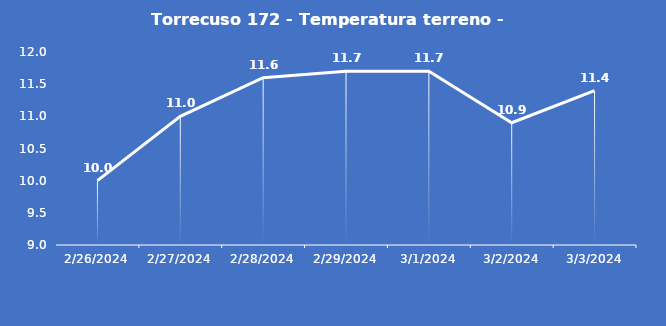
| Category | Torrecuso 172 - Temperatura terreno - Grezzo (°C) |
|---|---|
| 2/26/24 | 10 |
| 2/27/24 | 11 |
| 2/28/24 | 11.6 |
| 2/29/24 | 11.7 |
| 3/1/24 | 11.7 |
| 3/2/24 | 10.9 |
| 3/3/24 | 11.4 |